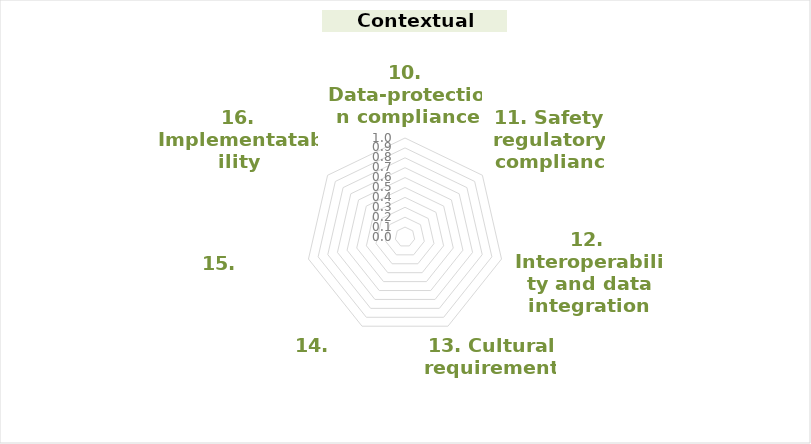
| Category | Series 0 |
|---|---|
| 10. Data-protection compliance | 0 |
| 11. Safety regulatory compliance | 0 |
| 12. Interoperability and data integration | 0 |
| 13. Cultural requirements | 0 |
| 14. Affordability | 0 |
| 15. Cost-benefit  | 0 |
| 16. Implementatability | 0 |